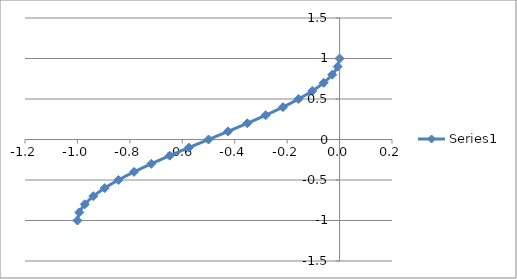
| Category | Series 0 |
|---|---|
| -1.0000025 | -1 |
| -0.9927518224999998 | -0.9 |
| -0.9720012799999999 | -0.8 |
| -0.9392508575 | -0.7 |
| -0.89600054 | -0.6 |
| -0.8437503125000001 | -0.5 |
| -0.78400016 | -0.4 |
| -0.7182500675000001 | -0.3 |
| -0.64800002 | -0.2 |
| -0.5747500025000001 | -0.1 |
| -0.5 | 0 |
| -0.4252499975000001 | 0.1 |
| -0.35199998000000005 | 0.2 |
| -0.2817499325000001 | 0.3 |
| -0.21599984000000003 | 0.4 |
| -0.1562496875 | 0.5 |
| -0.10399946000000007 | 0.6 |
| -0.06074914250000005 | 0.7 |
| -0.027998720000000005 | 0.8 |
| -0.007248177500000036 | 0.9 |
| 2.500000000016378e-06 | 1 |